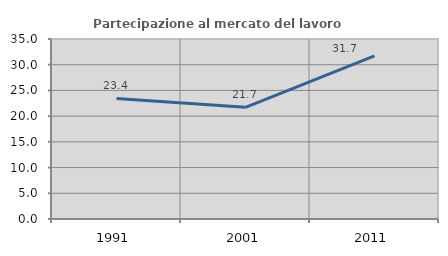
| Category | Partecipazione al mercato del lavoro  femminile |
|---|---|
| 1991.0 | 23.442 |
| 2001.0 | 21.712 |
| 2011.0 | 31.721 |